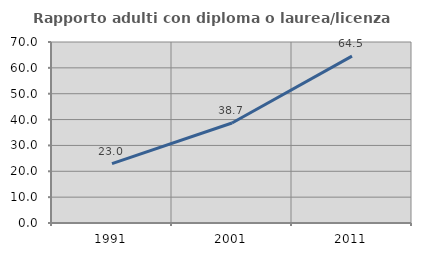
| Category | Rapporto adulti con diploma o laurea/licenza media  |
|---|---|
| 1991.0 | 22.967 |
| 2001.0 | 38.662 |
| 2011.0 | 64.548 |